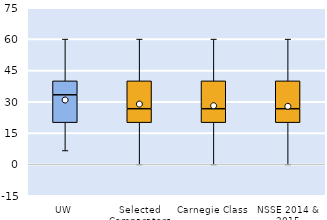
| Category | 25th | 50th | 75th |
|---|---|---|---|
| UW | 20 | 13.333 | 6.667 |
| Selected Comparators | 20 | 6.667 | 13.333 |
| Carnegie Class | 20 | 6.667 | 13.333 |
| NSSE 2014 & 2015 | 20 | 6.667 | 13.333 |